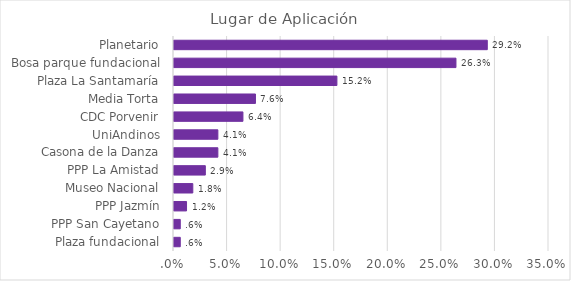
| Category | % del N de columna |
|---|---|
| Plaza fundacional | 0.006 |
| PPP San Cayetano | 0.006 |
| PPP Jazmín | 0.012 |
| Museo Nacional | 0.018 |
| PPP La Amistad | 0.029 |
| Casona de la Danza | 0.041 |
| UniAndinos | 0.041 |
| CDC Porvenir | 0.064 |
| Media Torta | 0.076 |
| Plaza La Santamaría | 0.152 |
| Bosa parque fundacional | 0.263 |
| Planetario | 0.292 |